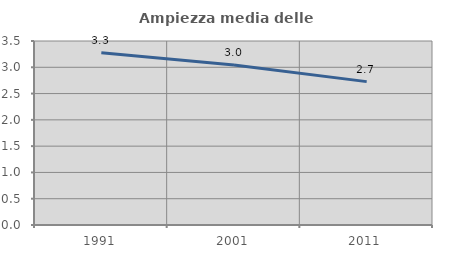
| Category | Ampiezza media delle famiglie |
|---|---|
| 1991.0 | 3.274 |
| 2001.0 | 3.043 |
| 2011.0 | 2.727 |